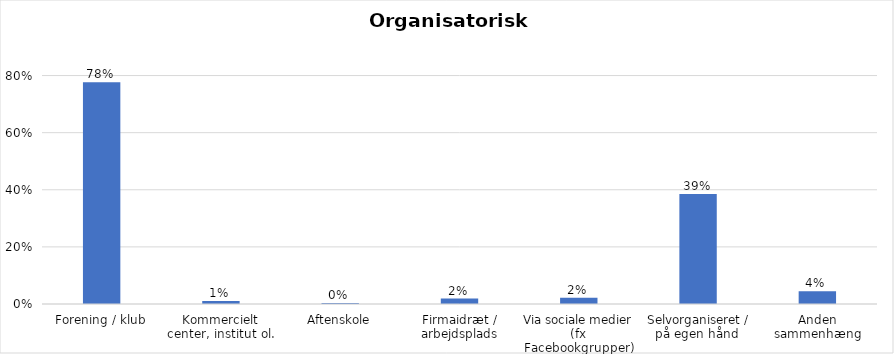
| Category | % |
|---|---|
| Forening / klub | 0.776 |
| Kommercielt center, institut ol. | 0.011 |
| Aftenskole | 0.004 |
| Firmaidræt / arbejdsplads | 0.019 |
| Via sociale medier (fx Facebookgrupper) | 0.022 |
| Selvorganiseret / på egen hånd  | 0.385 |
| Anden sammenhæng | 0.044 |